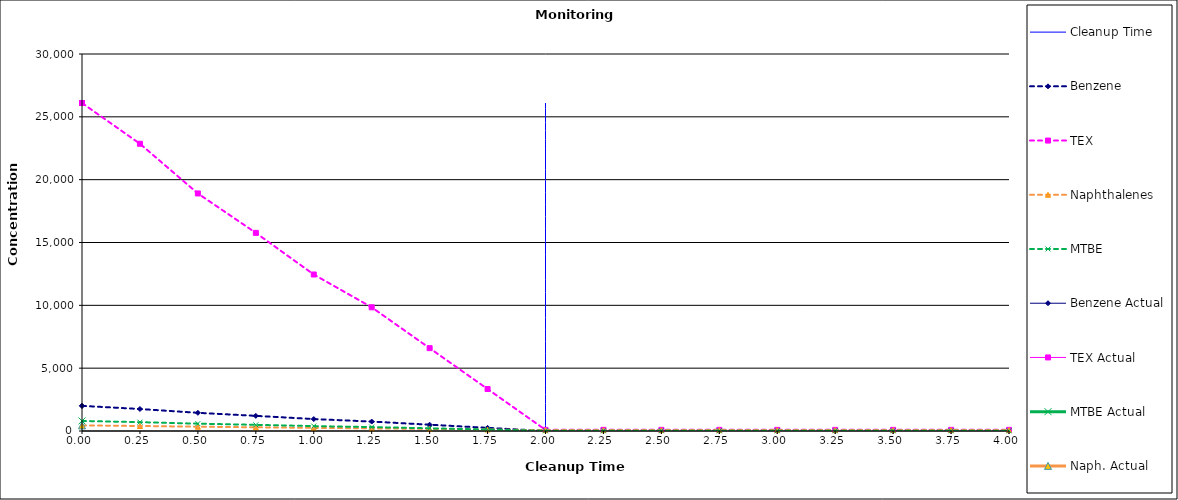
| Category | Cleanup Time |
|---|---|
| 2.0 | 0 |
| 2.0 | 26100 |